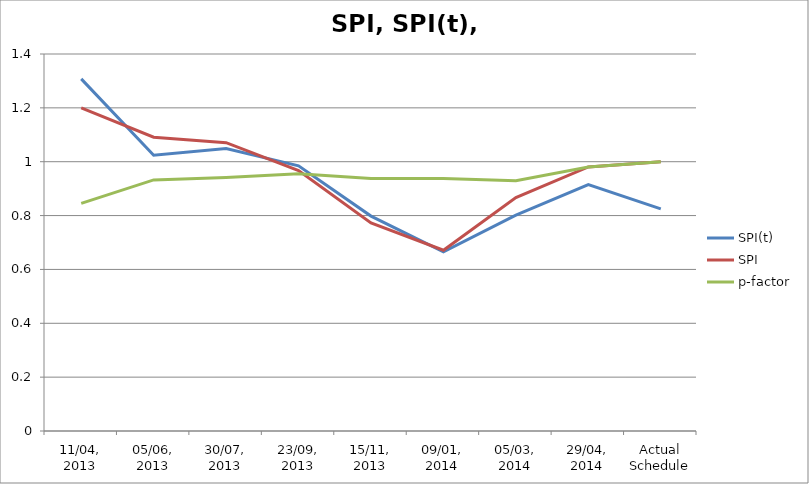
| Category | SPI(t) | SPI | p-factor |
|---|---|---|---|
| 11/04, 2013 | 1.308 | 1.2 | 0.845 |
| 05/06, 2013 | 1.024 | 1.091 | 0.932 |
| 30/07, 2013 | 1.049 | 1.071 | 0.941 |
| 23/09, 2013 | 0.985 | 0.967 | 0.955 |
| 15/11, 2013 | 0.798 | 0.773 | 0.938 |
| 09/01, 2014 | 0.665 | 0.671 | 0.938 |
| 05/03, 2014 | 0.802 | 0.867 | 0.929 |
| 29/04, 2014 | 0.915 | 0.98 | 0.98 |
| Actual Schedule | 0.825 | 1 | 1 |